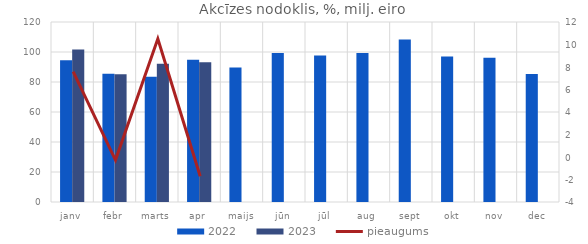
| Category | 2022 | 2023 |
|---|---|---|
| janv | 94.49 | 101.657 |
| febr | 85.432 | 85.2 |
| marts | 83.467 | 92.239 |
| apr | 94.762 | 93.144 |
| maijs | 89.709 | 0 |
| jūn | 99.296 | 0 |
| jūl | 97.607 | 0 |
| aug | 99.32 | 0 |
| sept | 108.37 | 0 |
| okt | 96.951 | 0 |
| nov | 96.244 | 0 |
| dec | 85.386 | 0 |